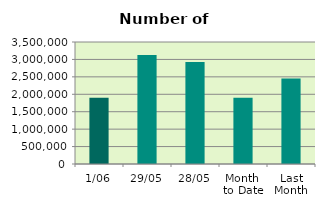
| Category | Series 0 |
|---|---|
| 1/06 | 1897090 |
| 29/05 | 3126406 |
| 28/05 | 2925104 |
| Month 
to Date | 1897090 |
| Last
Month | 2451339.2 |